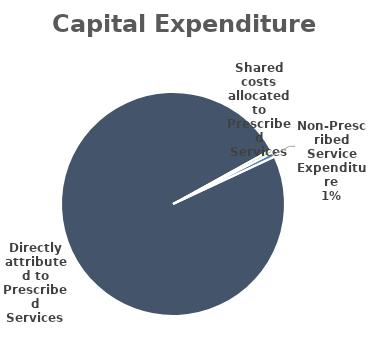
| Category | Series 0 |
|---|---|
| Directly attributed to Prescribed Services | 207.756 |
| Shared costs allocated to Prescribed Services | 0.951 |
| Non-Prescribed Service Expenditure | 1.361 |